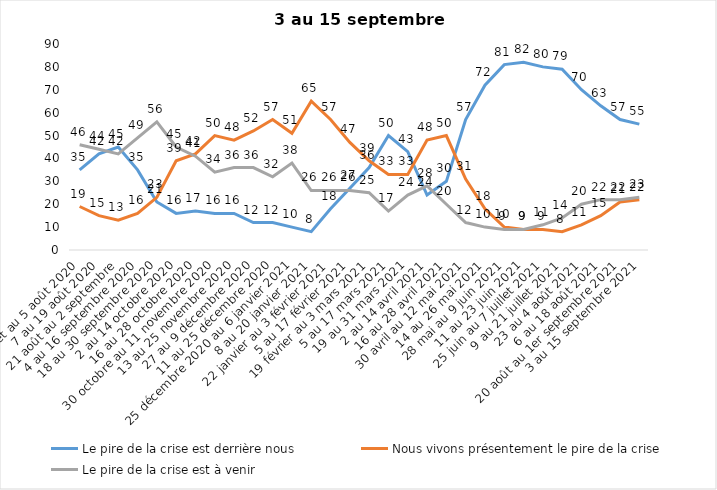
| Category | Le pire de la crise est derrière nous | Nous vivons présentement le pire de la crise | Le pire de la crise est à venir |
|---|---|---|---|
| 24 juillet au 5 août 2020 | 35 | 19 | 46 |
| 7 au 19 août 2020 | 42 | 15 | 44 |
| 21 août au 2 septembre | 45 | 13 | 42 |
| 4 au 16 septembre 2020 | 35 | 16 | 49 |
| 18 au 30 septembre 2020 | 21 | 23 | 56 |
| 2 au 14 octobre 2020 | 16 | 39 | 45 |
| 16 au 28 octobre 2020 | 17 | 42 | 41 |
| 30 octobre au 11 novembre 2020 | 16 | 50 | 34 |
| 13 au 25 novembre 2020 | 16 | 48 | 36 |
| 27 au 9 décembre 2020 | 12 | 52 | 36 |
| 11 au 25 décembre 2020 | 12 | 57 | 32 |
| 25 décembre 2020 au 6 janvier 2021 | 10 | 51 | 38 |
| 8 au 20 janvier 2021 | 8 | 65 | 26 |
| 22 janvier au 3 février 2021 | 18 | 57 | 26 |
| 5 au 17 février 2021 | 27 | 47 | 26 |
| 19 février au 3 mars 2021 | 36 | 39 | 25 |
| 5 au 17 mars 2021 | 50 | 33 | 17 |
| 19 au 31 mars 2021 | 43 | 33 | 24 |
| 2 au 14 avril 2021 | 24 | 48 | 28 |
| 16 au 28 avril 2021 | 30 | 50 | 20 |
| 30 avril au 12 mai 2021 | 57 | 31 | 12 |
| 14 au 26 mai 2021 | 72 | 18 | 10 |
| 28 mai au 9 juin 2021 | 81 | 10 | 9 |
| 11 au 23 juin 2021 | 82 | 9 | 9 |
| 25 juin au 7 juillet 2021 | 80 | 9 | 11 |
| 9 au 21 juillet 2021 | 79 | 8 | 14 |
| 23 au 4 août 2021 | 70 | 11 | 20 |
| 6 au 18 août 2021 | 63 | 15 | 22 |
| 20 août au 1er septembre 2021 | 57 | 21 | 22 |
| 3 au 15 septembre 2021 | 55 | 22 | 23 |